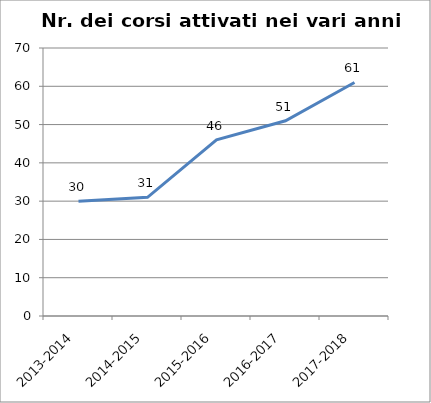
| Category | Nr. Corsi Attivati |
|---|---|
| 2013-2014 | 30 |
| 2014-2015 | 31 |
| 2015-2016 | 46 |
| 2016-2017 | 51 |
| 2017-2018 | 61 |